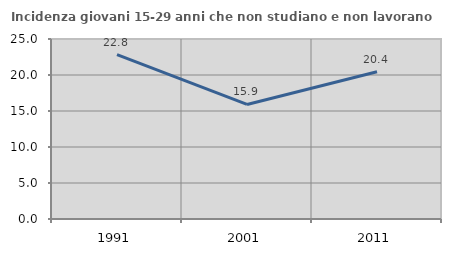
| Category | Incidenza giovani 15-29 anni che non studiano e non lavorano  |
|---|---|
| 1991.0 | 22.822 |
| 2001.0 | 15.909 |
| 2011.0 | 20.444 |